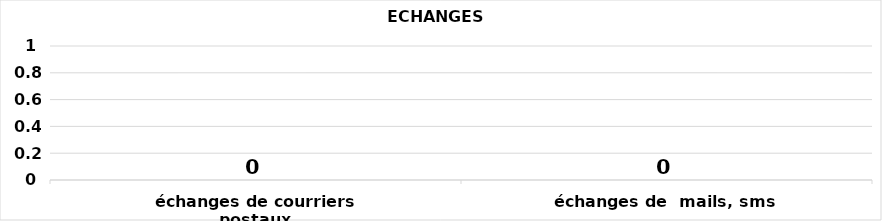
| Category | Series 0 |
|---|---|
| échanges de courriers postaux | 0 |
| échanges de  mails, sms | 0 |